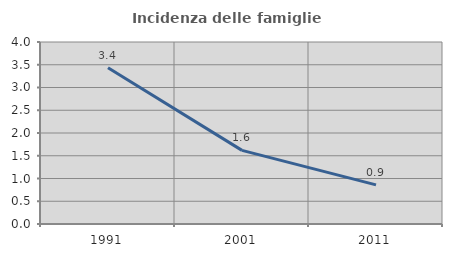
| Category | Incidenza delle famiglie numerose |
|---|---|
| 1991.0 | 3.433 |
| 2001.0 | 1.618 |
| 2011.0 | 0.861 |